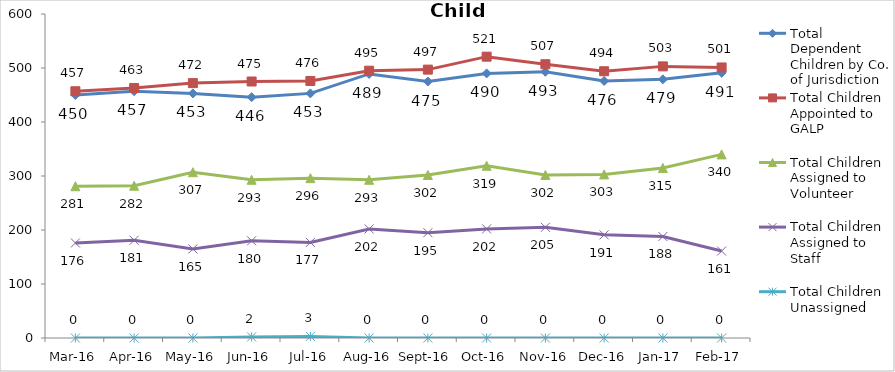
| Category | Total Dependent Children by Co. of Jurisdiction | Total Children Appointed to GALP | Total Children Assigned to Volunteer | Total Children Assigned to Staff | Total Children Unassigned |
|---|---|---|---|---|---|
| Mar-16 | 450 | 457 | 281 | 176 | 0 |
| Apr-16 | 457 | 463 | 282 | 181 | 0 |
| May-16 | 453 | 472 | 307 | 165 | 0 |
| Jun-16 | 446 | 475 | 293 | 180 | 2 |
| Jul-16 | 453 | 476 | 296 | 177 | 3 |
| Aug-16 | 489 | 495 | 293 | 202 | 0 |
| Sep-16 | 475 | 497 | 302 | 195 | 0 |
| Oct-16 | 490 | 521 | 319 | 202 | 0 |
| Nov-16 | 493 | 507 | 302 | 205 | 0 |
| Dec-16 | 476 | 494 | 303 | 191 | 0 |
| Jan-17 | 479 | 503 | 315 | 188 | 0 |
| Feb-17 | 491 | 501 | 340 | 161 | 0 |